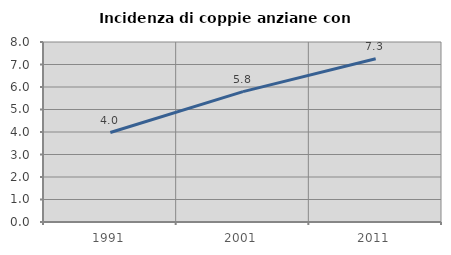
| Category | Incidenza di coppie anziane con figli |
|---|---|
| 1991.0 | 3.977 |
| 2001.0 | 5.793 |
| 2011.0 | 7.256 |